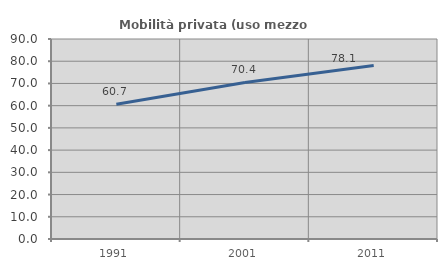
| Category | Mobilità privata (uso mezzo privato) |
|---|---|
| 1991.0 | 60.674 |
| 2001.0 | 70.44 |
| 2011.0 | 78.091 |